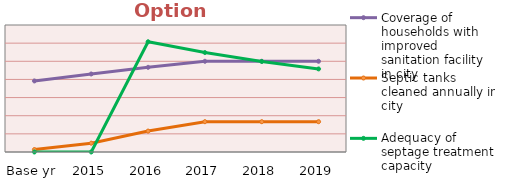
| Category | Coverage of households with improved sanitation facility in city | Septic tanks cleaned annually in city  | Adequacy of septage treatment capacity |
|---|---|---|---|
| Base yr | 0.783 | 0.027 | 0 |
| 2015 | 0.86 | 0.097 | 0 |
| 2016 | 0.933 | 0.23 | 1.215 |
| 2017 | 1 | 0.334 | 1.096 |
| 2018 | 1 | 0.334 | 0.998 |
| 2019 | 1 | 0.334 | 0.916 |